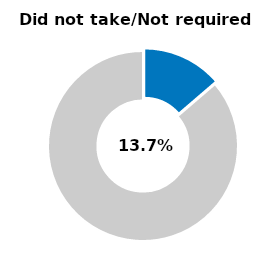
| Category | Series 0 |
|---|---|
| Did not take/not required | 0.137 |
| Other | 0.863 |